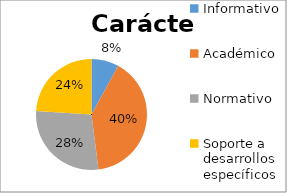
| Category | N° DOC |
|---|---|
| Informativo | 2 |
| Académico | 10 |
| Normativo | 7 |
| Soporte a desarrollos específicos | 6 |